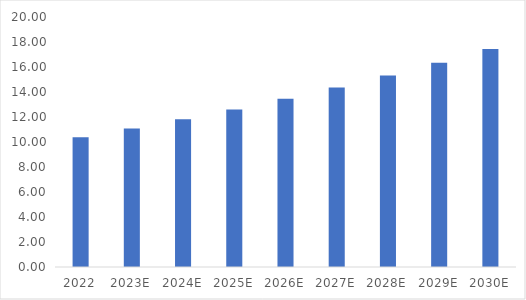
| Category | Series 0 |
|---|---|
| 2022 | 10.38 |
| 2023E | 11.075 |
| 2024E | 11.818 |
| 2025E | 12.609 |
| 2026E | 13.454 |
| 2027E | 14.356 |
| 2028E | 15.317 |
| 2029E | 16.344 |
| 2030E | 17.439 |